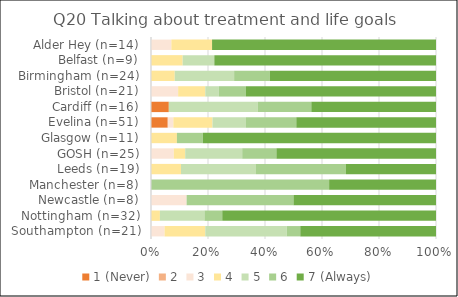
| Category | 1 (Never) | 2 | 3 | 4 | 5 | 6 | 7 (Always) |
|---|---|---|---|---|---|---|---|
| Southampton (n=21) | 0 | 0 | 1 | 3 | 6 | 1 | 10 |
| Nottingham (n=32) | 0 | 0 | 0 | 1 | 5 | 2 | 24 |
| Newcastle (n=8) | 0 | 0 | 1 | 0 | 0 | 3 | 4 |
| Manchester (n=8) | 0 | 0 | 0 | 0 | 0 | 5 | 3 |
| Leeds (n=19) | 0 | 0 | 0 | 2 | 5 | 6 | 6 |
| GOSH (n=25) | 0 | 0 | 2 | 1 | 5 | 3 | 14 |
| Glasgow (n=11) | 0 | 0 | 0 | 1 | 0 | 1 | 9 |
| Evelina (n=51) | 3 | 0 | 1 | 7 | 6 | 9 | 25 |
| Cardiff (n=16) | 1 | 0 | 0 | 0 | 5 | 3 | 7 |
| Bristol (n=21) | 0 | 0 | 2 | 2 | 1 | 2 | 14 |
| Birmingham (n=24) | 0 | 0 | 0 | 2 | 5 | 3 | 14 |
| Belfast (n=9) | 0 | 0 | 0 | 1 | 1 | 0 | 7 |
| Alder Hey (n=14) | 0 | 0 | 1 | 2 | 0 | 0 | 11 |